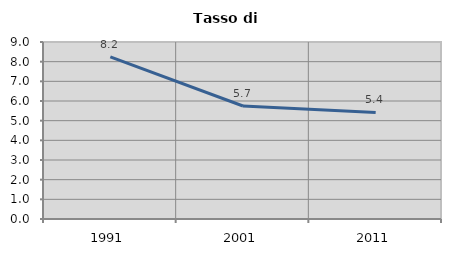
| Category | Tasso di disoccupazione   |
|---|---|
| 1991.0 | 8.24 |
| 2001.0 | 5.745 |
| 2011.0 | 5.418 |